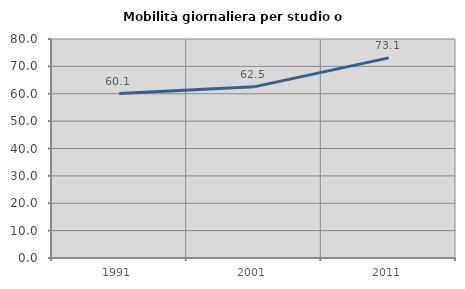
| Category | Mobilità giornaliera per studio o lavoro |
|---|---|
| 1991.0 | 60.062 |
| 2001.0 | 62.516 |
| 2011.0 | 73.114 |